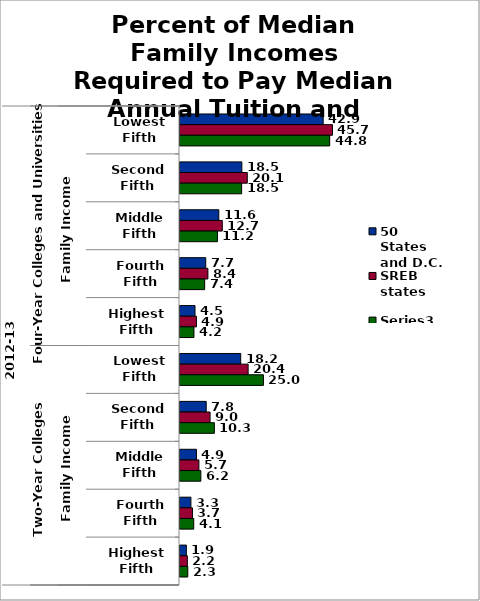
| Category | 50 States and D.C. | SREB states | Series 2 |
|---|---|---|---|
| 0 | 42.875 | 45.655 | 44.821 |
| 1 | 18.517 | 20.148 | 18.456 |
| 2 | 11.618 | 12.661 | 11.205 |
| 3 | 7.704 | 8.355 | 7.382 |
| 4 | 4.494 | 4.933 | 4.178 |
| 5 | 18.175 | 20.398 | 24.974 |
| 6 | 7.849 | 9.002 | 10.283 |
| 7 | 4.925 | 5.657 | 6.243 |
| 8 | 3.266 | 3.733 | 4.113 |
| 9 | 1.905 | 2.204 | 2.328 |